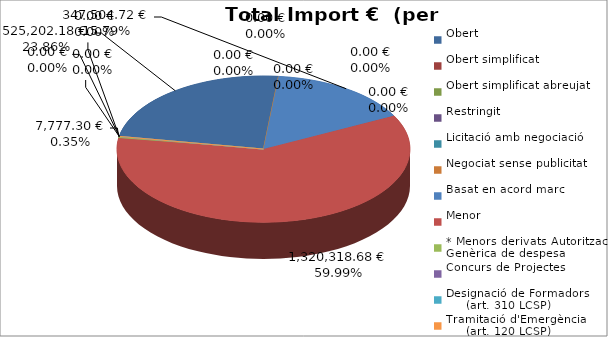
| Category | Total preu
(amb IVA) |
|---|---|
| Obert | 525202.18 |
| Obert simplificat | 0 |
| Obert simplificat abreujat | 0 |
| Restringit | 0 |
| Licitació amb negociació | 0 |
| Negociat sense publicitat | 0 |
| Basat en acord marc | 347504.72 |
| Menor | 1320318.68 |
| * Menors derivats Autorització Genèrica de despesa | 7777.3 |
| Concurs de Projectes | 0 |
| Designació de Formadors
     (art. 310 LCSP) | 0 |
| Tramitació d'Emergència
     (art. 120 LCSP) | 0 |